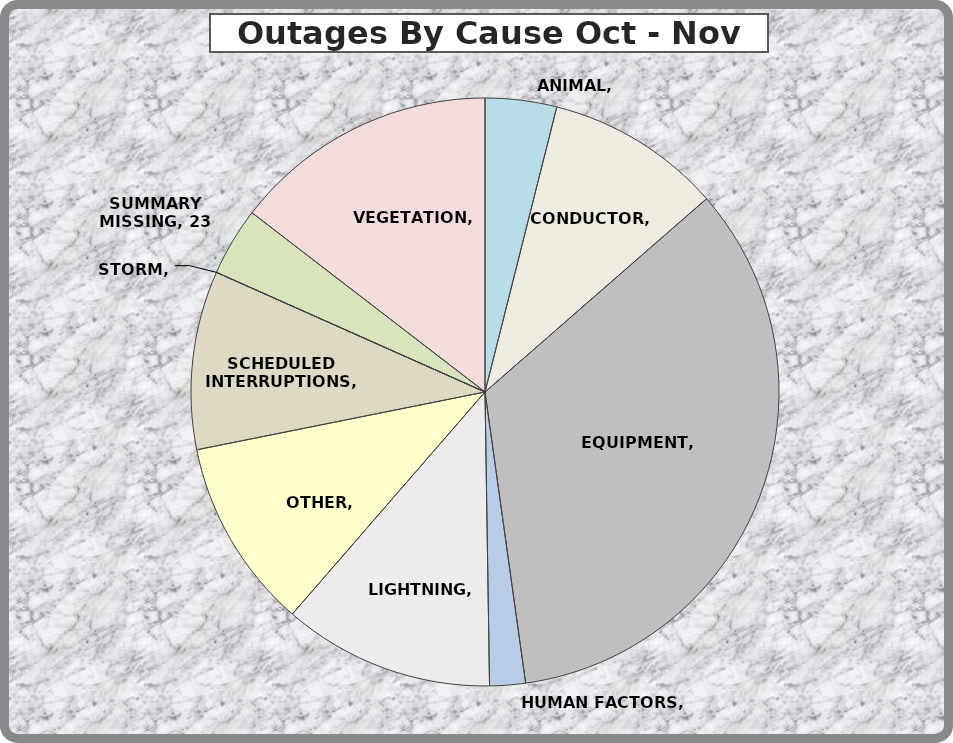
| Category | Series 0 |
|---|---|
| ANIMAL | 24 |
| CONDUCTOR | 59 |
| EQUIPMENT | 209 |
| HUMAN FACTORS | 12 |
| LIGHTNING | 71 |
| OTHER | 64 |
| SCHEDULED INTERRUPTIONS | 60 |
| STORM | 0 |
| SUMMARY MISSING | 23 |
| VEGETATION | 89 |